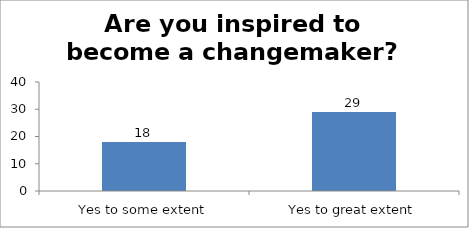
| Category | Are you inspired to become a changemaker?   |
|---|---|
| Yes to some extent | 18 |
| Yes to great extent | 29 |